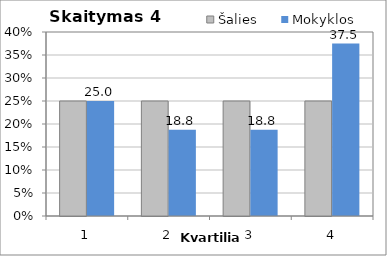
| Category | Šalies | Mokyklos |
|---|---|---|
| 1.0 | 25 | 25 |
| 2.0 | 25 | 18.75 |
| 3.0 | 25 | 18.75 |
| 4.0 | 25 | 37.5 |